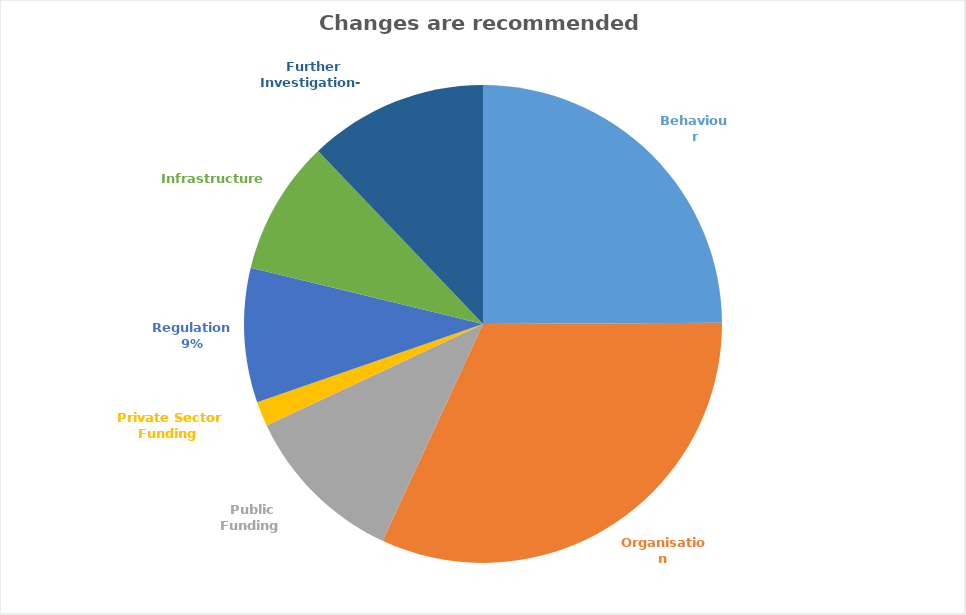
| Category | Changes are recommended in Number recommended |
|---|---|
| Behaviour | 74 |
| Organisation  | 95 |
| Public Funding  | 33 |
| Private Sector Funding  | 5 |
| Regulation  | 27 |
| Infrastructure   | 27 |
| Further Investigation-  | 36 |